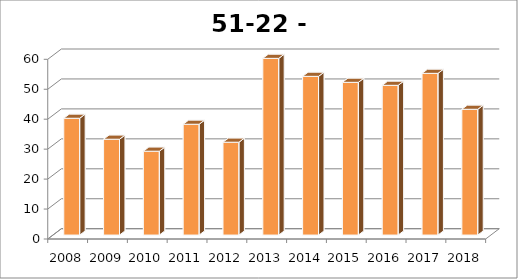
| Category | Spoordonk |
|---|---|
| 2008.0 | 39 |
| 2009.0 | 32 |
| 2010.0 | 28 |
| 2011.0 | 37 |
| 2012.0 | 31 |
| 2013.0 | 59 |
| 2014.0 | 53 |
| 2015.0 | 51 |
| 2016.0 | 50 |
| 2017.0 | 54 |
| 2018.0 | 42 |